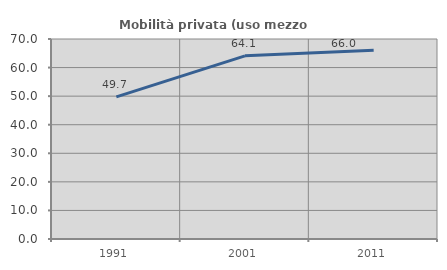
| Category | Mobilità privata (uso mezzo privato) |
|---|---|
| 1991.0 | 49.734 |
| 2001.0 | 64.098 |
| 2011.0 | 66.041 |